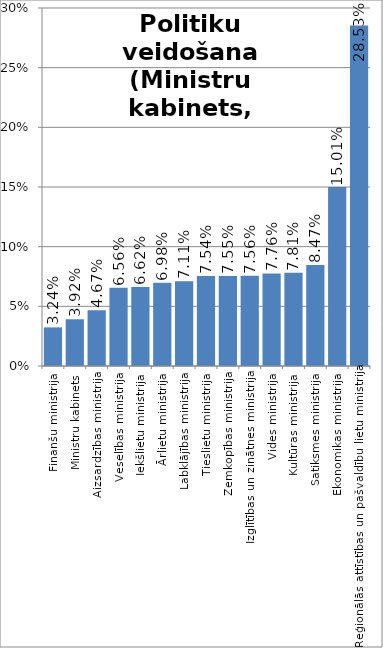
| Category | Politiku veidošana (Ministru kabinets, ministriju centrālie aparāti) |
|---|---|
| Finanšu ministrija | 0.032 |
| Ministru kabinets | 0.039 |
| Aizsardzības ministrija | 0.047 |
| Veselības ministrija | 0.066 |
| Iekšlietu ministrija | 0.066 |
| Ārlietu ministrija | 0.07 |
| Labklājības ministrija | 0.071 |
| Tieslietu ministrija | 0.075 |
| Zemkopības ministrija | 0.075 |
| Izglītības un zinātnes ministrija | 0.076 |
| Vides ministrija | 0.078 |
| Kultūras ministrija | 0.078 |
| Satiksmes ministrija | 0.085 |
| Ekonomikas ministrija | 0.15 |
| Reģionālās attīstības un pašvaldību lietu ministrija | 0.285 |